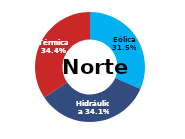
| Category | Norte |
|---|---|
| Eólica | 105.557 |
| Hidráulica | 114.011 |
| Solar | 0 |
| Térmica | 115.049 |